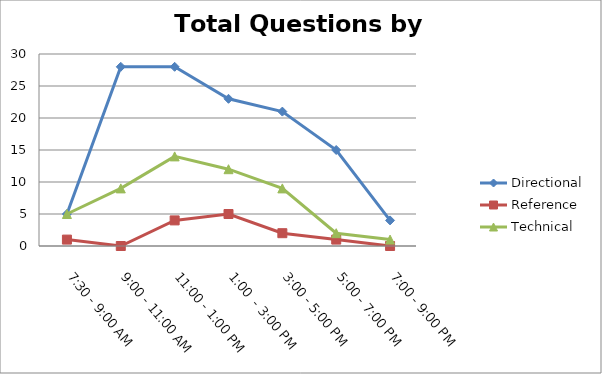
| Category | Directional | Reference | Technical |
|---|---|---|---|
| 7:30 - 9:00 AM | 5 | 1 | 5 |
| 9:00 - 11:00 AM | 28 | 0 | 9 |
| 11:00 - 1:00 PM | 28 | 4 | 14 |
| 1:00  - 3:00 PM | 23 | 5 | 12 |
| 3:00 - 5:00 PM | 21 | 2 | 9 |
| 5:00 - 7:00 PM | 15 | 1 | 2 |
| 7:00 - 9:00 PM | 4 | 0 | 1 |